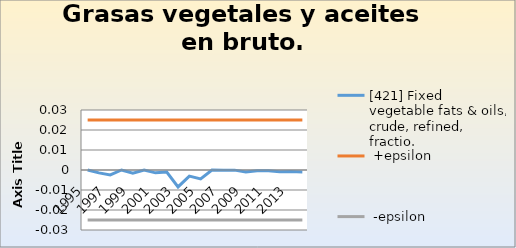
| Category | [421] Fixed vegetable fats & oils, crude, refined, fractio. |  +epsilon |  -epsilon |
|---|---|---|---|
| 1995.0 | 0 | 0.025 | -0.025 |
| 1996.0 | -0.001 | 0.025 | -0.025 |
| 1997.0 | -0.002 | 0.025 | -0.025 |
| 1998.0 | 0 | 0.025 | -0.025 |
| 1999.0 | -0.002 | 0.025 | -0.025 |
| 2000.0 | 0 | 0.025 | -0.025 |
| 2001.0 | -0.001 | 0.025 | -0.025 |
| 2002.0 | -0.001 | 0.025 | -0.025 |
| 2003.0 | -0.008 | 0.025 | -0.025 |
| 2004.0 | -0.003 | 0.025 | -0.025 |
| 2005.0 | -0.004 | 0.025 | -0.025 |
| 2006.0 | 0 | 0.025 | -0.025 |
| 2007.0 | 0 | 0.025 | -0.025 |
| 2008.0 | 0 | 0.025 | -0.025 |
| 2009.0 | -0.001 | 0.025 | -0.025 |
| 2010.0 | 0 | 0.025 | -0.025 |
| 2011.0 | 0 | 0.025 | -0.025 |
| 2012.0 | -0.001 | 0.025 | -0.025 |
| 2013.0 | -0.001 | 0.025 | -0.025 |
| 2014.0 | -0.001 | 0.025 | -0.025 |